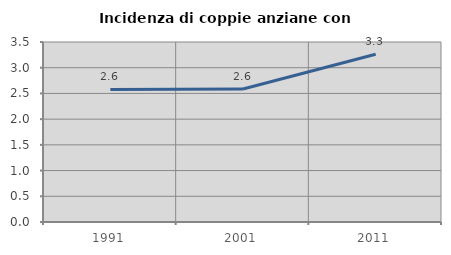
| Category | Incidenza di coppie anziane con figli |
|---|---|
| 1991.0 | 2.578 |
| 2001.0 | 2.585 |
| 2011.0 | 3.263 |